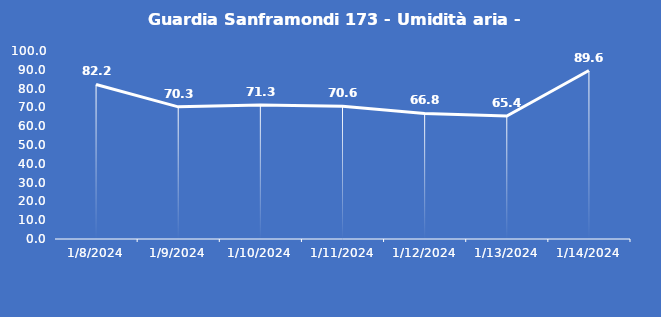
| Category | Guardia Sanframondi 173 - Umidità aria - Grezzo (%) |
|---|---|
| 1/8/24 | 82.2 |
| 1/9/24 | 70.3 |
| 1/10/24 | 71.3 |
| 1/11/24 | 70.6 |
| 1/12/24 | 66.8 |
| 1/13/24 | 65.4 |
| 1/14/24 | 89.6 |